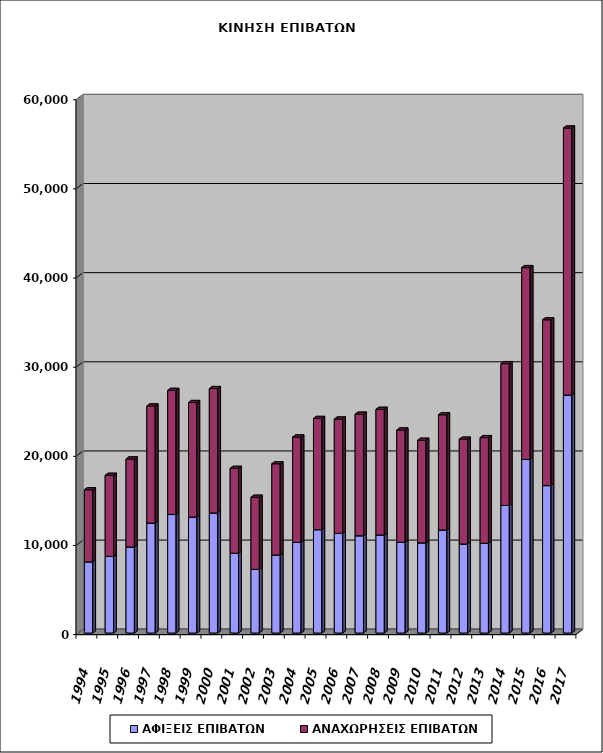
| Category | ΑΦΙΞΕΙΣ ΕΠΙΒΑΤΩΝ | ΑΝΑΧΩΡΗΣΕΙΣ ΕΠΙΒΑΤΩΝ |
|---|---|---|
| 1994.0 | 7980 | 8080 |
| 1995.0 | 8589 | 9100 |
| 1996.0 | 9644 | 9877 |
| 1997.0 | 12335 | 13133 |
| 1998.0 | 13291 | 13923 |
| 1999.0 | 13010 | 12845 |
| 2000.0 | 13470 | 13952 |
| 2001.0 | 8951 | 9517 |
| 2002.0 | 7144 | 8086 |
| 2003.0 | 8752 | 10233 |
| 2004.0 | 10169 | 11814 |
| 2005.0 | 11593 | 12473 |
| 2006.0 | 11177 | 12822 |
| 2007.0 | 10908 | 13638 |
| 2008.0 | 10997 | 14093 |
| 2009.0 | 10184 | 12591 |
| 2010.0 | 10112 | 11507 |
| 2011.0 | 11562 | 12913 |
| 2012.0 | 9982 | 11757 |
| 2013.0 | 10066 | 11853 |
| 2014.0 | 14305 | 15913 |
| 2015.0 | 19474 | 21516 |
| 2016.0 | 16537 | 18598 |
| 2017.0 | 26697 | 29950 |